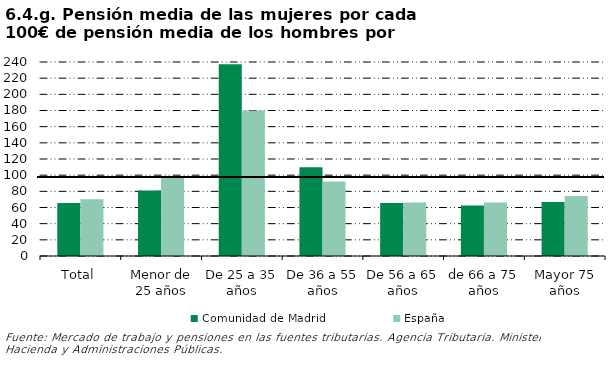
| Category | Comunidad de Madrid | España |
|---|---|---|
| Total | 65.437 | 70.067 |
| Menor de 25 años | 80.913 | 98.93 |
| De 25 a 35 años | 237.244 | 179.912 |
| De 36 a 55 años | 109.648 | 92.238 |
| De 56 a 65 años | 65.655 | 66.339 |
| de 66 a 75 años | 62.36 | 66.253 |
| Mayor 75 años | 66.761 | 74.253 |